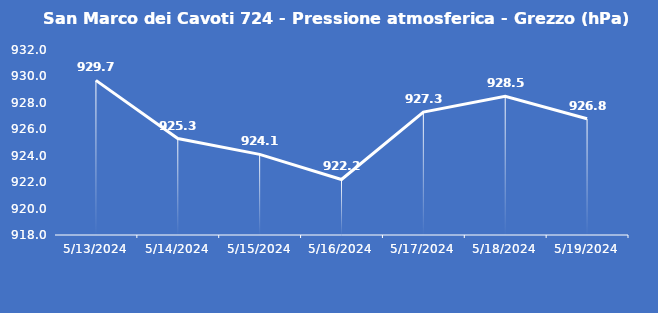
| Category | San Marco dei Cavoti 724 - Pressione atmosferica - Grezzo (hPa) |
|---|---|
| 5/13/24 | 929.7 |
| 5/14/24 | 925.3 |
| 5/15/24 | 924.1 |
| 5/16/24 | 922.2 |
| 5/17/24 | 927.3 |
| 5/18/24 | 928.5 |
| 5/19/24 | 926.8 |